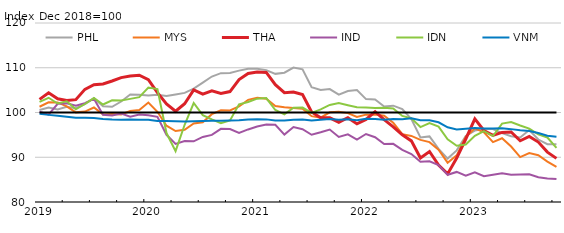
| Category | PHL | MYS | THA | IND | IDN | VNM | ref |
|---|---|---|---|---|---|---|---|
| 2019-01-01 | 100.574 | 101.283 | 102.928 | 100.174 | 102.357 | 99.7 | 100 |
| 2019-02-01 | 101.109 | 102.279 | 104.407 | 99.521 | 103.29 | 99.468 | 100 |
| 2019-03-01 | 100.679 | 102.252 | 103.065 | 101.934 | 102.012 | 99.261 | 100 |
| 2019-04-01 | 101.261 | 101.369 | 102.701 | 102.055 | 102.506 | 99.071 | 100 |
| 2019-05-01 | 100.97 | 100.031 | 102.866 | 101.505 | 100.724 | 98.819 | 100 |
| 2019-06-01 | 101.865 | 100.204 | 105.166 | 102.083 | 101.901 | 98.799 | 100 |
| 2019-07-01 | 103.18 | 101.123 | 106.196 | 103.046 | 103.226 | 98.761 | 100 |
| 2019-08-01 | 101.372 | 99.577 | 106.387 | 99.5 | 101.79 | 98.566 | 100 |
| 2019-09-01 | 101.274 | 99.687 | 107.035 | 99.33 | 102.734 | 98.449 | 100 |
| 2019-10-01 | 102.456 | 99.561 | 107.79 | 99.753 | 102.687 | 98.395 | 100 |
| 2019-11-01 | 104.026 | 100.325 | 108.159 | 99.075 | 103.044 | 98.443 | 100 |
| 2019-12-01 | 103.943 | 100.54 | 108.319 | 99.545 | 103.421 | 98.364 | 100 |
| 2020-01-01 | 103.797 | 102.214 | 107.344 | 99.374 | 105.569 | 98.354 | 100 |
| 2020-02-01 | 103.989 | 100.151 | 104.422 | 99.026 | 105.232 | 98.126 | 100 |
| 2020-03-01 | 103.665 | 97.044 | 101.911 | 95.017 | 95.409 | 98.104 | 100 |
| 2020-04-01 | 104.009 | 95.85 | 100.292 | 92.996 | 91.363 | 98.027 | 100 |
| 2020-05-01 | 104.378 | 96.139 | 101.955 | 93.623 | 97.255 | 97.964 | 100 |
| 2020-06-01 | 105.333 | 97.561 | 105.027 | 93.561 | 102.12 | 98.051 | 100 |
| 2020-07-01 | 106.674 | 97.827 | 104.109 | 94.534 | 99.414 | 98.107 | 100 |
| 2020-08-01 | 108.038 | 99.634 | 104.837 | 94.994 | 98.455 | 98.165 | 100 |
| 2020-09-01 | 108.789 | 100.506 | 104.257 | 96.341 | 97.636 | 98.174 | 100 |
| 2020-10-01 | 108.842 | 100.453 | 104.675 | 96.287 | 98.228 | 98.215 | 100 |
| 2020-11-01 | 109.361 | 101.352 | 107.354 | 95.422 | 101.827 | 98.292 | 100 |
| 2020-12-01 | 109.79 | 102.817 | 108.734 | 96.215 | 102.338 | 98.43 | 100 |
| 2021-01-01 | 109.795 | 103.298 | 109.036 | 96.885 | 103.094 | 98.469 | 100 |
| 2021-02-01 | 109.47 | 103.071 | 108.963 | 97.291 | 103.227 | 98.463 | 100 |
| 2021-03-01 | 108.636 | 101.458 | 106.212 | 97.272 | 100.553 | 98.22 | 100 |
| 2021-04-01 | 108.888 | 101.184 | 104.417 | 95.054 | 99.585 | 98.19 | 100 |
| 2021-05-01 | 110.038 | 101.015 | 104.586 | 96.758 | 101.073 | 98.375 | 100 |
| 2021-06-01 | 109.651 | 100.861 | 104.024 | 96.269 | 101.097 | 98.453 | 100 |
| 2021-07-01 | 105.659 | 99.182 | 100.127 | 95.028 | 99.902 | 98.212 | 100 |
| 2021-08-01 | 105.046 | 98.857 | 98.838 | 95.571 | 100.689 | 98.374 | 100 |
| 2021-09-01 | 105.239 | 100.043 | 98.815 | 96.194 | 101.683 | 98.52 | 100 |
| 2021-10-01 | 103.98 | 100.159 | 97.829 | 94.545 | 102.102 | 98.397 | 100 |
| 2021-11-01 | 104.79 | 99.863 | 98.84 | 95.107 | 101.637 | 98.515 | 100 |
| 2021-12-01 | 105.018 | 98.991 | 97.459 | 93.95 | 101.173 | 98.293 | 100 |
| 2022-01-01 | 102.994 | 99.523 | 98.451 | 95.196 | 101.128 | 98.619 | 100 |
| 2022-02-01 | 102.902 | 99.577 | 100.182 | 94.483 | 101.017 | 98.564 | 100 |
| 2022-03-01 | 101.335 | 99.283 | 98.387 | 92.97 | 101.034 | 98.403 | 100 |
| 2022-04-01 | 101.526 | 97.692 | 96.804 | 92.991 | 100.892 | 98.568 | 100 |
| 2022-05-01 | 100.778 | 95.172 | 95.027 | 91.642 | 99.24 | 98.502 | 100 |
| 2022-06-01 | 98.508 | 94.761 | 93.652 | 90.707 | 98.695 | 98.704 | 100 |
| 2022-07-01 | 94.412 | 93.873 | 89.838 | 88.996 | 96.747 | 98.258 | 100 |
| 2022-08-01 | 94.653 | 93.383 | 91.28 | 89.091 | 97.618 | 98.243 | 100 |
| 2022-09-01 | 91.878 | 91.697 | 88.242 | 88.261 | 96.829 | 97.814 | 100 |
| 2022-10-01 | 89.706 | 88.785 | 86.273 | 86.076 | 94.029 | 96.684 | 100 |
| 2022-11-01 | 91.53 | 90.428 | 89.821 | 86.72 | 92.581 | 96.215 | 100 |
| 2022-12-01 | 94.765 | 94.541 | 94.074 | 85.886 | 92.84 | 96.36 | 100 |
| 2023-01-01 | 95.959 | 96.46 | 98.561 | 86.656 | 94.781 | 96.519 | 100 |
| 2023-02-01 | 96.324 | 95.545 | 95.987 | 85.755 | 95.841 | 96.418 | 100 |
| 2023-03-01 | 96.302 | 93.387 | 94.905 | 86.102 | 94.747 | 96.449 | 100 |
| 2023-04-01 | 95.397 | 94.24 | 95.546 | 86.415 | 97.513 | 96.478 | 100 |
| 2023-05-01 | 94.691 | 92.387 | 95.639 | 86.069 | 97.881 | 96.283 | 100 |
| 2023-06-01 | 94.408 | 90.037 | 93.689 | 86.145 | 97.086 | 96.026 | 100 |
| 2023-07-01 | 96.082 | 90.931 | 94.639 | 86.217 | 96.391 | 95.875 | 100 |
| 2023-08-01 | 93.962 | 90.451 | 93.393 | 85.535 | 95.092 | 95.408 | 100 |
| 2023-09-01 | 92.925 | 89.027 | 91.146 | 85.269 | 94.417 | 94.8 | 100 |
| 2023-10-01 | 92.922 | 87.842 | 89.747 | 85.119 | 92.095 | 94.59 | 100 |